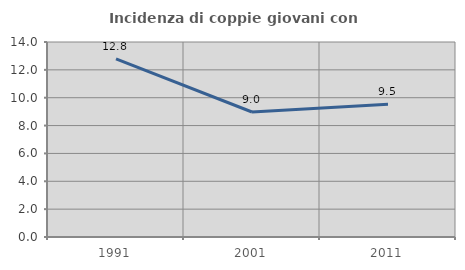
| Category | Incidenza di coppie giovani con figli |
|---|---|
| 1991.0 | 12.787 |
| 2001.0 | 8.975 |
| 2011.0 | 9.526 |